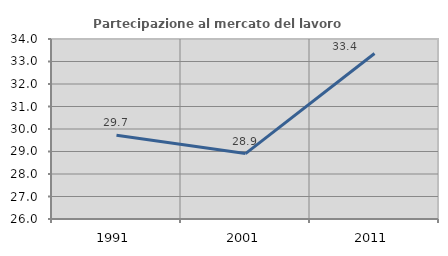
| Category | Partecipazione al mercato del lavoro  femminile |
|---|---|
| 1991.0 | 29.727 |
| 2001.0 | 28.907 |
| 2011.0 | 33.354 |